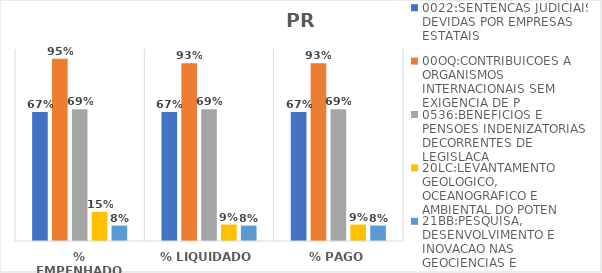
| Category | 0022:SENTENCAS JUDICIAIS DEVIDAS POR EMPRESAS ESTATAIS | 00OQ:CONTRIBUICOES A ORGANISMOS INTERNACIONAIS SEM EXIGENCIA DE P | 0536:BENEFICIOS E PENSOES INDENIZATORIAS DECORRENTES DE LEGISLACA | 20LC:LEVANTAMENTO GEOLOGICO, OCEANOGRAFICO E AMBIENTAL DO POTEN | 21BB:PESQUISA, DESENVOLVIMENTO E INOVACAO NAS GEOCIENCIAS E |
|---|---|---|---|---|---|
| % EMPENHADO | 0.671 | 0.95 | 0.687 | 0.151 | 0.08 |
| % LIQUIDADO | 0.671 | 0.926 | 0.687 | 0.086 | 0.08 |
| % PAGO | 0.671 | 0.926 | 0.687 | 0.086 | 0.08 |